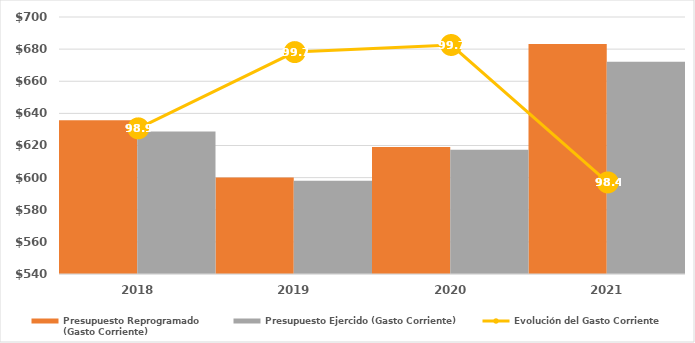
| Category | Presupuesto Reprogramado
(Gasto Corriente) | Presupuesto Ejercido (Gasto Corriente) |
|---|---|---|
| 2018.0 | 635662.96 | 628777.639 |
| 2019.0 | 600084.757 | 598036.132 |
| 2020.0 | 619034.656 | 617347.742 |
| 2021.0 | 683166.418 | 672172.234 |